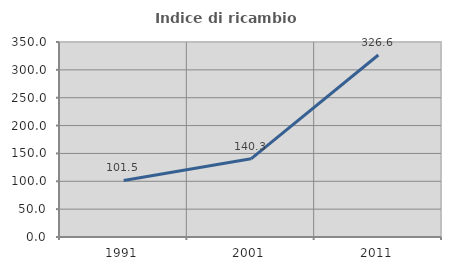
| Category | Indice di ricambio occupazionale  |
|---|---|
| 1991.0 | 101.486 |
| 2001.0 | 140.325 |
| 2011.0 | 326.627 |